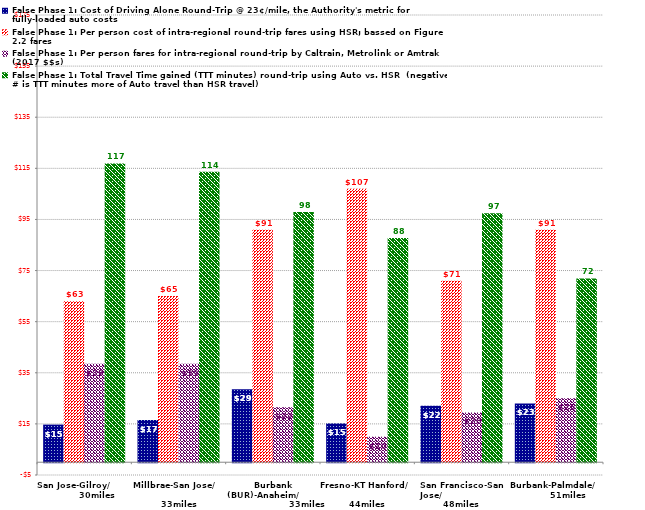
| Category | False Phase 1: Cost of Driving Alone Round-Trip @ 23¢/mile, the Authority's metric for fully-loaded auto costs | False Phase 1: Per person cost of intra-regional round-trip fares using HSR; bassed on Figure 2.2 fares | False Phase 1: Per person fares for intra-regional round-trip by Caltrain, Metrolink or Amtrak (2017 $$s) | False Phase 1: Total Travel Time gained (TTT minutes) round-trip using Auto vs. HSR  (negative # is TTT minutes more of Auto travel than HSR travel) |
|---|---|---|---|---|
| San Jose-Gilroy/                 30miles | 14.72 | 63 | 38.5 | 116.9 |
| Millbrae-San Jose/                                    33miles | 16.56 | 65 | 38.5 | 113.7 |
| Burbank (BUR)-Anaheim/                             33miles | 28.52 | 91 | 21.5 | 97.9 |
| Fresno-KT Hanford/                               44miles | 15.18 | 107 | 10 | 87.7 |
| San Francisco-San Jose/                       48miles | 22.08 | 71 | 19.5 | 97.4 |
| Burbank-Palmdale/           51miles  | 23 | 91 | 25 | 71.9 |